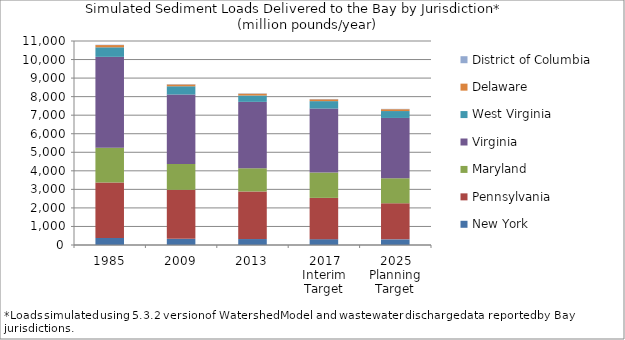
| Category | New York  | Pennsylvania  | Maryland  | Virginia  | West Virginia  | Delaware  | District of Columbia  |
|---|---|---|---|---|---|---|---|
| 1985 | 377.51 | 2998.755 | 1871.292 | 4896.349 | 516.092 | 120.887 | 17.499 |
| 2009 | 331.836 | 2644.074 | 1395.117 | 3742.921 | 445.408 | 98.947 | 16.948 |
| 2013 | 321.297 | 2564.915 | 1252.731 | 3578.027 | 344.981 | 98.723 | 17.102 |
| 2017 Interim Target | 315.43 | 2224.769 | 1367.84 | 3447.998 | 401.715 | 99.455 | 17.213 |
| 2025 Planning Target | 304.493 | 1945.232 | 1349.654 | 3251.382 | 372.587 | 99.794 | 17.39 |